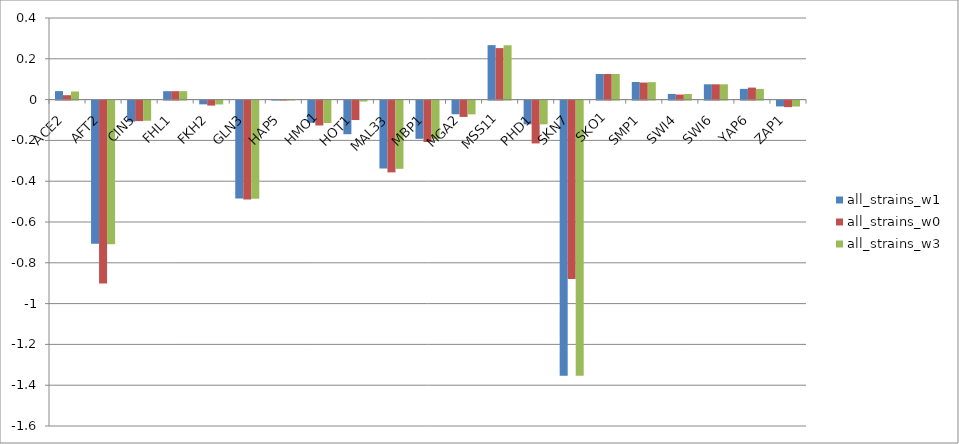
| Category | all_strains_w1 | all_strains_w0 | all_strains_w3 |
|---|---|---|---|
| ACE2 | 0.042 | 0.022 | 0.04 |
| AFT2 | -0.701 | -0.897 | -0.704 |
| CIN5 | -0.103 | -0.101 | -0.099 |
| FHL1 | 0.041 | 0.041 | 0.041 |
| FKH2 | -0.018 | -0.025 | -0.019 |
| GLN3 | -0.48 | -0.485 | -0.481 |
| HAP5 | 0 | 0 | 0 |
| HMO1 | -0.109 | -0.122 | -0.11 |
| HOT1 | -0.165 | -0.095 | -0.005 |
| MAL33 | -0.333 | -0.352 | -0.334 |
| MBP1 | -0.187 | -0.203 | -0.189 |
| MGA2 | -0.067 | -0.08 | -0.067 |
| MSS11 | 0.267 | 0.252 | 0.266 |
| PHD1 | -0.116 | -0.21 | -0.116 |
| SKN7 | -1.349 | -0.875 | -1.349 |
| SKO1 | 0.126 | 0.126 | 0.126 |
| SMP1 | 0.086 | 0.084 | 0.086 |
| SWI4 | 0.028 | 0.025 | 0.027 |
| SWI6 | 0.075 | 0.075 | 0.075 |
| YAP6 | 0.053 | 0.059 | 0.052 |
| ZAP1 | -0.029 | -0.032 | -0.029 |